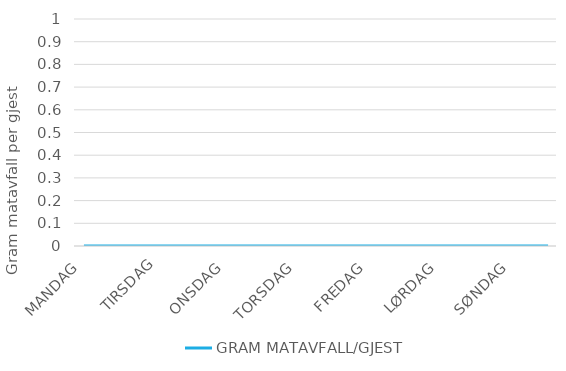
| Category |  GRAM MATAVFALL/GJEST  |
|---|---|
| MANDAG | 0 |
|  | 0 |
|  | 0 |
|  | 0 |
| TIRSDAG | 0 |
|  | 0 |
|  | 0 |
|  | 0 |
| ONSDAG | 0 |
|  | 0 |
|  | 0 |
|  | 0 |
| TORSDAG | 0 |
|  | 0 |
|  | 0 |
|  | 0 |
| FREDAG | 0 |
|  | 0 |
|  | 0 |
|  | 0 |
| LØRDAG | 0 |
|  | 0 |
|  | 0 |
|  | 0 |
| SØNDAG | 0 |